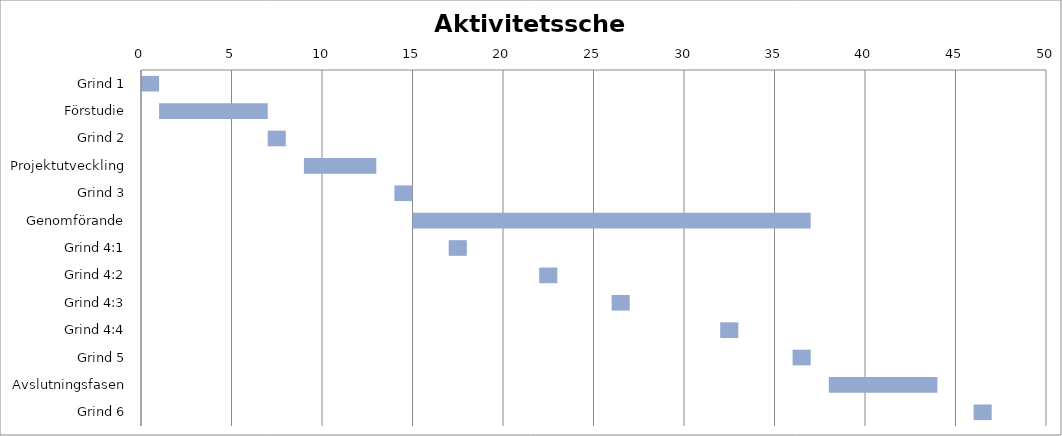
| Category | Start | Varaktighet |
|---|---|---|
| Grind 1 | 0 | 1 |
| Förstudie | 1 | 6 |
| Grind 2 | 7 | 1 |
| Projektutveckling | 9 | 4 |
| Grind 3 | 14 | 1 |
| Genomförande | 15 | 22 |
| Grind 4:1 | 17 | 1 |
| Grind 4:2 | 22 | 1 |
| Grind 4:3 | 26 | 1 |
| Grind 4:4 | 32 | 1 |
| Grind 5 | 36 | 1 |
| Avslutningsfasen | 38 | 6 |
| Grind 6 | 46 | 1 |